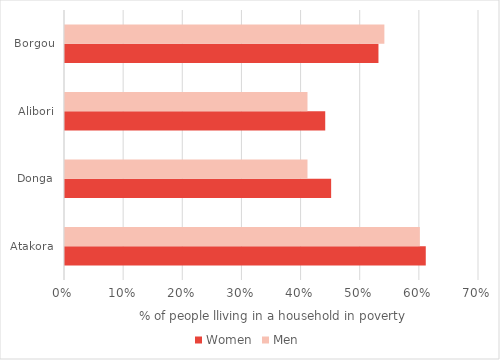
| Category | Women | Men |
|---|---|---|
| Atakora | 0.61 | 0.6 |
| Donga | 0.45 | 0.41 |
| Alibori | 0.44 | 0.41 |
| Borgou | 0.53 | 0.54 |